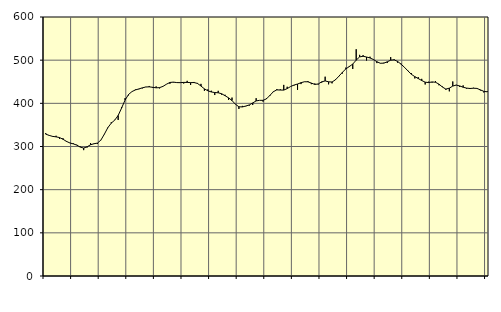
| Category | Piggar | Series 1 |
|---|---|---|
| nan | 331 | 328.6 |
| 87.0 | 326.2 | 325.7 |
| 87.0 | 322.6 | 323.39 |
| 87.0 | 324.9 | 322.35 |
| nan | 317.7 | 320.74 |
| 88.0 | 319.2 | 316.77 |
| 88.0 | 310.7 | 311.92 |
| 88.0 | 308.6 | 308.17 |
| nan | 307.4 | 306.06 |
| 89.0 | 304 | 303.21 |
| 89.0 | 300 | 298.6 |
| 89.0 | 291.6 | 296.44 |
| nan | 297.7 | 299.28 |
| 90.0 | 308 | 304.08 |
| 90.0 | 306 | 306.39 |
| 90.0 | 305.8 | 307.92 |
| nan | 314.6 | 314.93 |
| 91.0 | 328.1 | 328.57 |
| 91.0 | 342.7 | 343.6 |
| 91.0 | 356.2 | 354.16 |
| nan | 361.6 | 361.03 |
| 92.0 | 361.5 | 371.9 |
| 92.0 | 391.4 | 389.26 |
| 92.0 | 412.1 | 407.54 |
| nan | 418.5 | 420.41 |
| 93.0 | 427.2 | 427.2 |
| 93.0 | 432.1 | 431.04 |
| 93.0 | 432.7 | 433.38 |
| nan | 434.6 | 435.86 |
| 94.0 | 438.1 | 437.83 |
| 94.0 | 440.2 | 438.21 |
| 94.0 | 435.8 | 437.15 |
| nan | 439.2 | 435.94 |
| 95.0 | 434.6 | 436.36 |
| 95.0 | 439.3 | 439.27 |
| 95.0 | 444.1 | 444.29 |
| nan | 445.3 | 448.36 |
| 96.0 | 448.3 | 449.15 |
| 96.0 | 448 | 448.05 |
| 96.0 | 447.3 | 447.9 |
| nan | 445.9 | 448.51 |
| 97.0 | 452.1 | 448.42 |
| 97.0 | 442.5 | 447.99 |
| 97.0 | 449.5 | 448.16 |
| nan | 447.2 | 446.06 |
| 98.0 | 445.1 | 440.11 |
| 98.0 | 429 | 433.56 |
| 98.0 | 432.3 | 429.08 |
| nan | 429.2 | 426.31 |
| 99.0 | 419.2 | 425.04 |
| 99.0 | 429 | 424.43 |
| 99.0 | 419.9 | 422.22 |
| nan | 419.8 | 417.63 |
| 0.0 | 407.8 | 412.73 |
| 0.0 | 413.3 | 406.43 |
| 0.0 | 398.3 | 397.82 |
| nan | 386.9 | 392.07 |
| 1.0 | 394.1 | 391.65 |
| 1.0 | 393.1 | 393.78 |
| 1.0 | 394.6 | 396.25 |
| nan | 396.1 | 400.91 |
| 2.0 | 411.9 | 405.62 |
| 2.0 | 406.9 | 406.93 |
| 2.0 | 403.9 | 406.94 |
| nan | 411.8 | 410.42 |
| 3.0 | 417.2 | 418.51 |
| 3.0 | 427.9 | 426.99 |
| 3.0 | 433 | 431.18 |
| nan | 432.4 | 430.77 |
| 4.0 | 442.7 | 430.65 |
| 4.0 | 438.4 | 434.08 |
| 4.0 | 439.1 | 439.03 |
| nan | 441.5 | 442.4 |
| 5.0 | 431.2 | 444.75 |
| 5.0 | 444.6 | 447.76 |
| 5.0 | 450.2 | 450 |
| nan | 451.7 | 449.86 |
| 6.0 | 444.4 | 446.93 |
| 6.0 | 446 | 443.75 |
| 6.0 | 443.6 | 444.93 |
| nan | 448 | 449.81 |
| 7.0 | 461.7 | 451.9 |
| 7.0 | 444 | 449.84 |
| 7.0 | 446.3 | 449.39 |
| nan | 455.7 | 454.5 |
| 8.0 | 462.7 | 463.05 |
| 8.0 | 469.1 | 471.77 |
| 8.0 | 482.7 | 479.76 |
| nan | 486.6 | 485.14 |
| 9.0 | 479.6 | 490.96 |
| 9.0 | 525.3 | 500.13 |
| 9.0 | 512.3 | 507.57 |
| nan | 511.6 | 509.02 |
| 10.0 | 499.1 | 507.28 |
| 10.0 | 508 | 505.12 |
| 10.0 | 502.1 | 501.54 |
| nan | 493.2 | 496.37 |
| 11.0 | 493.3 | 492.86 |
| 11.0 | 494 | 493.04 |
| 11.0 | 493.4 | 496.2 |
| nan | 507.1 | 499.98 |
| 12.0 | 502 | 500.67 |
| 12.0 | 494.2 | 497.12 |
| 12.0 | 491.9 | 490.75 |
| nan | 482.9 | 483.43 |
| 13.0 | 475.6 | 475.1 |
| 13.0 | 469.8 | 467.26 |
| 13.0 | 457.7 | 461.86 |
| nan | 460.6 | 457.37 |
| 14.0 | 456.7 | 452.83 |
| 14.0 | 443.7 | 449.01 |
| 14.0 | 450.2 | 448.11 |
| nan | 448 | 449.57 |
| 15.0 | 451.6 | 448.81 |
| 15.0 | 441.8 | 444.44 |
| 15.0 | 438.9 | 437.71 |
| nan | 431.2 | 432.99 |
| 16.0 | 427.8 | 435.13 |
| 16.0 | 450.6 | 439.99 |
| 16.0 | 442.8 | 442.25 |
| nan | 438 | 440.32 |
| 17.0 | 441.6 | 437.26 |
| 17.0 | 434 | 435.27 |
| 17.0 | 433.3 | 434.38 |
| nan | 436 | 435.04 |
| 18.0 | 434.1 | 434.57 |
| 18.0 | 429.9 | 431.2 |
| 18.0 | 425.1 | 427.79 |
| nan | 428.2 | 426.65 |